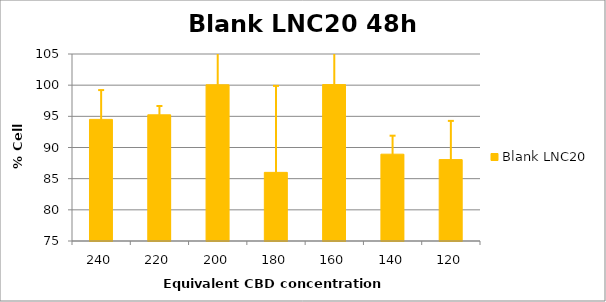
| Category | Blank LNC20 |
|---|---|
| 240.0 | 94.51 |
| 220.0 | 95.242 |
| 200.0 | 100.058 |
| 180.0 | 86.012 |
| 160.0 | 100.093 |
| 140.0 | 88.929 |
| 120.0 | 88.06 |